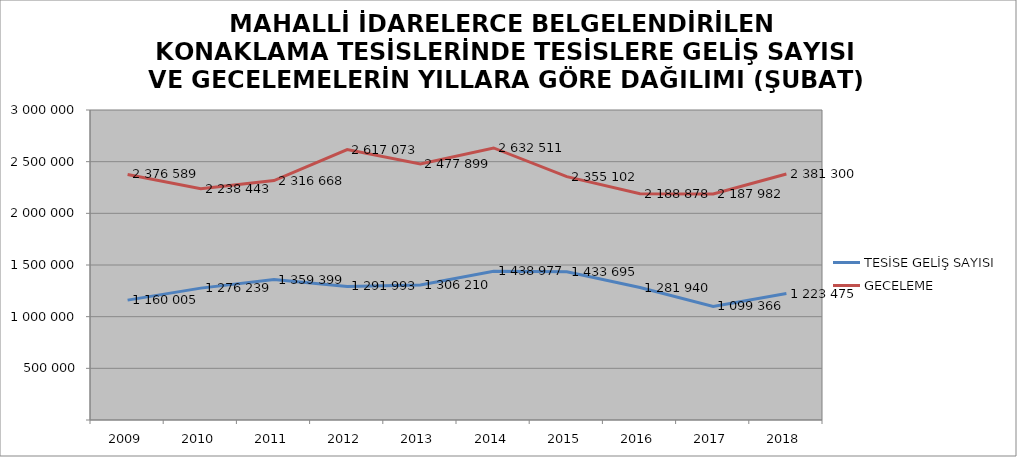
| Category | TESİSE GELİŞ SAYISI | GECELEME |
|---|---|---|
| 2009 | 1160005 | 2376589 |
| 2010 | 1276239 | 2238443 |
| 2011 | 1359399 | 2316668 |
| 2012 | 1291993 | 2617073 |
| 2013 | 1306210 | 2477899 |
| 2014 | 1438977 | 2632511 |
| 2015 | 1433695 | 2355102 |
| 2016 | 1281940 | 2188878 |
| 2017 | 1099366 | 2187982 |
| 2018 | 1223475 | 2381300 |